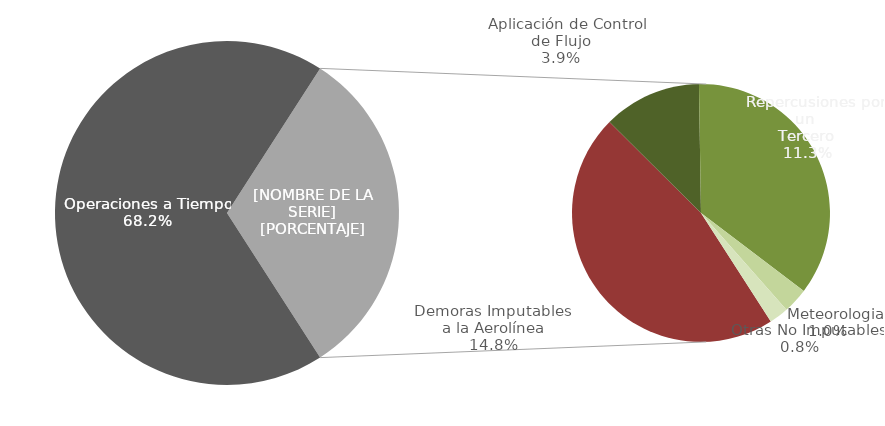
| Category | Demoras |
|---|---|
| Operaciones a Tiempo | 2581 |
| Demoras Imputables 
a la Aerolínea | 560 |
|    Aplicación de Control 
de Flujo | 148 |
|    Repercusiones por un 
Tercero | 428 |
|    Meteorologia | 38 |
|    Otras No Imputables | 29 |